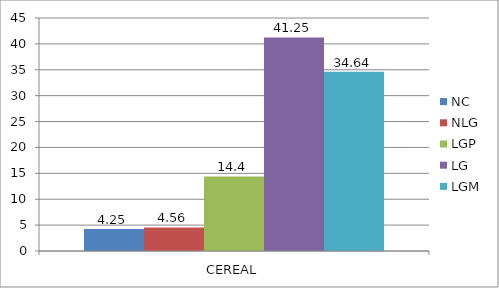
| Category | NC | NLG | LGP | LG | LGM |
|---|---|---|---|---|---|
| 0 | 4.25 | 4.56 | 14.4 | 41.25 | 34.64 |